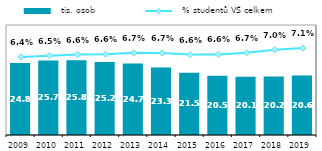
| Category |   tis. osob |
|---|---|
| 2009 | 24.83 |
| 2010 | 25.707 |
| 2011 | 25.794 |
| 2012 | 25.194 |
| 2013 | 24.721 |
| 2014 | 23.297 |
| 2015 | 21.469 |
| 2016 | 20.49 |
| 2017 | 20.099 |
| 2018 | 20.198 |
| 2019 | 20.552 |